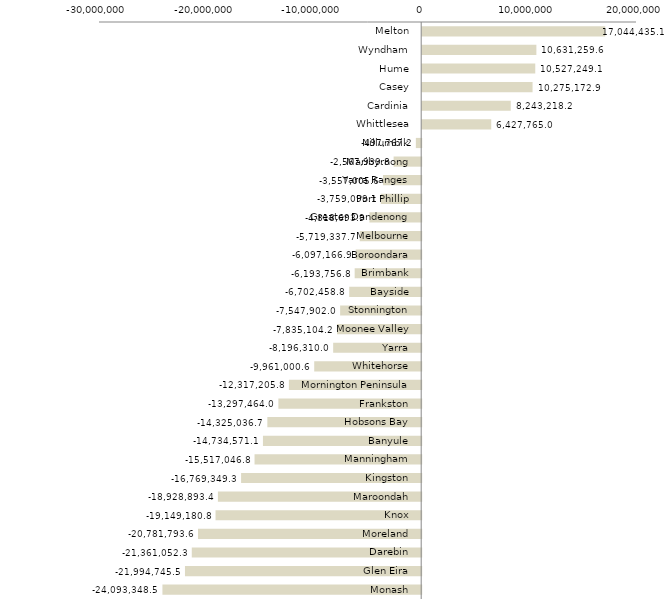
| Category | Series 0 |
|---|---|
| Melton | 17044435.113 |
| Wyndham | 10631259.643 |
| Hume | 10527249.081 |
| Casey | 10275172.894 |
| Cardinia | 8243218.204 |
| Whittlesea | 6427765.015 |
| Nillumbik | -497767.187 |
| Maribyrnong | -2567939.776 |
| Yarra Ranges | -3557005.552 |
| Port Phillip | -3759099.101 |
| Greater Dandenong | -4818693.937 |
| Melbourne | -5719337.721 |
| Boroondara | -6097166.878 |
| Brimbank | -6193756.76 |
| Bayside | -6702458.818 |
| Stonnington | -7547901.997 |
| Moonee Valley | -7835104.184 |
| Yarra | -8196310.036 |
| Whitehorse | -9961000.591 |
| Mornington Peninsula | -12317205.766 |
| Frankston | -13297463.999 |
| Hobsons Bay | -14325036.66 |
| Banyule | -14734571.143 |
| Manningham | -15517046.813 |
| Kingston | -16769349.333 |
| Maroondah | -18928893.351 |
| Knox | -19149180.768 |
| Moreland | -20781793.566 |
| Darebin | -21361052.287 |
| Glen Eira | -21994745.516 |
| Monash | -24093348.476 |